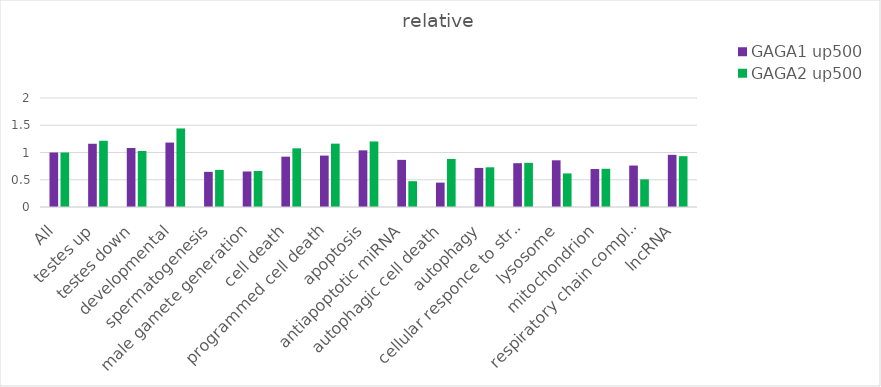
| Category | GAGA1 up500 | GAGA2 up500 |
|---|---|---|
| All | 1 | 1 |
| testes up | 1.16 | 1.215 |
| testes down | 1.083 | 1.027 |
| developmental | 1.182 | 1.441 |
| spermatogenesis | 0.645 | 0.681 |
| male gamete generation | 0.652 | 0.66 |
| cell death | 0.924 | 1.076 |
| programmed cell death | 0.943 | 1.162 |
| apoptosis | 1.04 | 1.203 |
| antiapoptotic miRNA | 0.865 | 0.474 |
| autophagic cell death | 0.447 | 0.882 |
| autophagy | 0.717 | 0.728 |
| cellular responce to stress | 0.804 | 0.811 |
| lysosome | 0.857 | 0.617 |
| mitochondrion | 0.697 | 0.701 |
| respiratory chain complex | 0.761 | 0.507 |
| lncRNA | 0.957 | 0.932 |